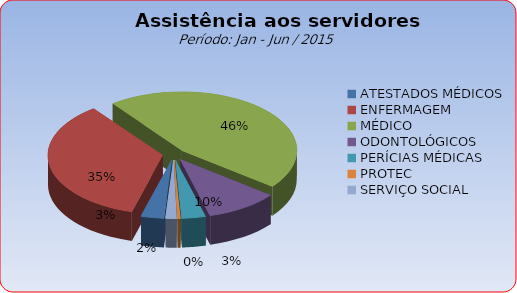
| Category | Series 0 |
|---|---|
| ATESTADOS MÉDICOS | 3.234 |
| ENFERMAGEM | 35.355 |
| MÉDICO | 45.858 |
| ODONTOLÓGICOS | 10.235 |
| PERÍCIAS MÉDICAS | 3.34 |
| PROTEC | 0.428 |
| SERVIÇO SOCIAL | 1.55 |